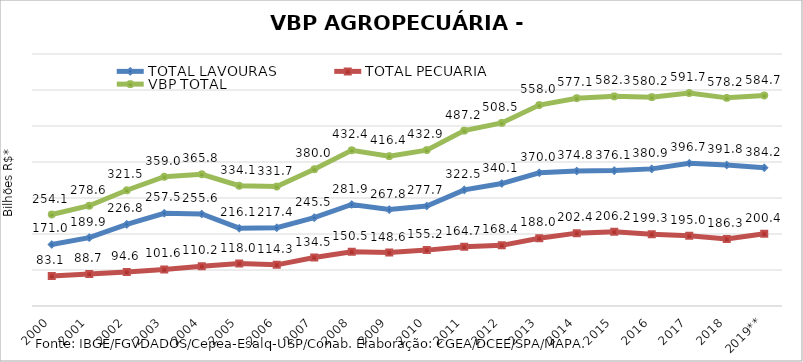
| Category | TOTAL LAVOURAS | TOTAL PECUÁRIA | VBP TOTAL |
|---|---|---|---|
| 2000 | 170.957 | 83.1 | 254.057 |
| 2001 | 189.901 | 88.658 | 278.559 |
| 2002 | 226.844 | 94.642 | 321.486 |
| 2003 | 257.466 | 101.582 | 359.048 |
| 2004 | 255.581 | 110.188 | 365.769 |
| 2005 | 216.082 | 118.038 | 334.12 |
| 2006 | 217.402 | 114.321 | 331.723 |
| 2007 | 245.516 | 134.492 | 380.009 |
| 2008 | 281.913 | 150.529 | 432.442 |
| 2009 | 267.78 | 148.571 | 416.351 |
| 2010 | 277.718 | 155.228 | 432.946 |
| 2011 | 322.535 | 164.657 | 487.192 |
| 2012 | 340.074 | 168.434 | 508.508 |
| 2013 | 370.003 | 188.037 | 558.039 |
| 2014 | 374.763 | 202.381 | 577.144 |
| 2015 | 376.123 | 206.171 | 582.294 |
| 2016 | 380.879 | 199.316 | 580.195 |
| 2017 | 396.704 | 195.033 | 591.737 |
| 2018 | 391.84 | 186.335 | 578.175 |
| 2019** | 384.22 | 200.436 | 584.656 |